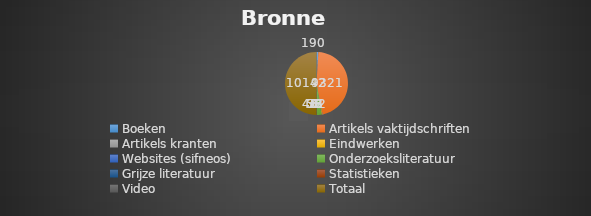
| Category | Aantal | Procent |
|---|---|---|
| Boeken | 190 | 0.019 |
| Artikels vaktijdschriften | 9321 | 0.919 |
| Artikels kranten | 36 | 0.004 |
| Eindwerken | 73 | 0.007 |
| Websites (sifneos) | 6 | 0.001 |
| Onderzoeksliteratuur | 452 | 0.045 |
| Grijze literatuur  | 0 | 0 |
| Statistieken | 6 | 0.001 |
| Video | 58 | 0.006 |
| Totaal | 10142 | 1 |